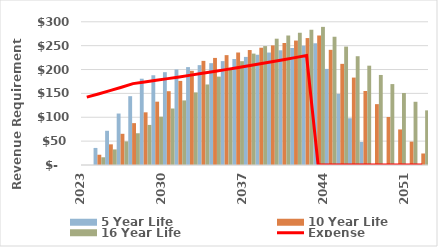
| Category | 5 Year Life | 10 Year Life | 16 Year Life |
|---|---|---|---|
| 2023.0 | 0 | 0 | 0 |
| 2024.0 | 35.738 | 21.512 | 16.177 |
| 2025.0 | 71.667 | 43.288 | 32.645 |
| 2026.0 | 107.8 | 65.341 | 49.419 |
| 2027.0 | 144.15 | 87.688 | 66.515 |
| 2028.0 | 180.731 | 110.344 | 83.949 |
| 2029.0 | 187.97 | 132.643 | 101.225 |
| 2030.0 | 194.446 | 154.576 | 118.34 |
| 2031.0 | 200.146 | 176.138 | 135.291 |
| 2032.0 | 205.053 | 197.32 | 152.074 |
| 2033.0 | 209.154 | 218.115 | 168.686 |
| 2034.0 | 213.337 | 224.29 | 185.123 |
| 2035.0 | 217.604 | 230.134 | 201.383 |
| 2036.0 | 221.956 | 235.642 | 217.461 |
| 2037.0 | 226.395 | 240.807 | 233.354 |
| 2038.0 | 230.923 | 245.623 | 249.058 |
| 2039.0 | 235.542 | 250.536 | 264.57 |
| 2040.0 | 240.253 | 255.546 | 270.994 |
| 2041.0 | 245.058 | 260.657 | 277.263 |
| 2042.0 | 249.959 | 265.871 | 283.374 |
| 2043.0 | 254.958 | 271.188 | 289.324 |
| 2044.0 | 201.266 | 241.223 | 268.498 |
| 2045.0 | 148.898 | 211.858 | 248.005 |
| 2046.0 | 97.879 | 183.104 | 227.851 |
| 2047.0 | 48.237 | 154.974 | 208.043 |
| 2048.0 | 0 | 127.479 | 188.588 |
| 2049.0 | 0 | 100.633 | 169.492 |
| 2050.0 | 0 | 74.449 | 150.765 |
| 2051.0 | 0 | 48.94 | 132.411 |
| 2052.0 | 0 | 24.119 | 114.44 |